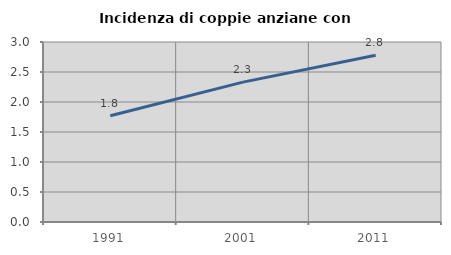
| Category | Incidenza di coppie anziane con figli |
|---|---|
| 1991.0 | 1.771 |
| 2001.0 | 2.331 |
| 2011.0 | 2.78 |